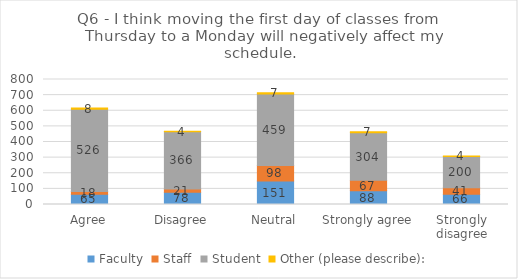
| Category | Faculty | Staff | Student | Other (please describe): |
|---|---|---|---|---|
| Agree | 65 | 18 | 526 | 8 |
| Disagree | 78 | 21 | 366 | 4 |
| Neutral | 151 | 98 | 459 | 7 |
| Strongly agree | 88 | 67 | 304 | 7 |
| Strongly disagree | 66 | 41 | 200 | 4 |